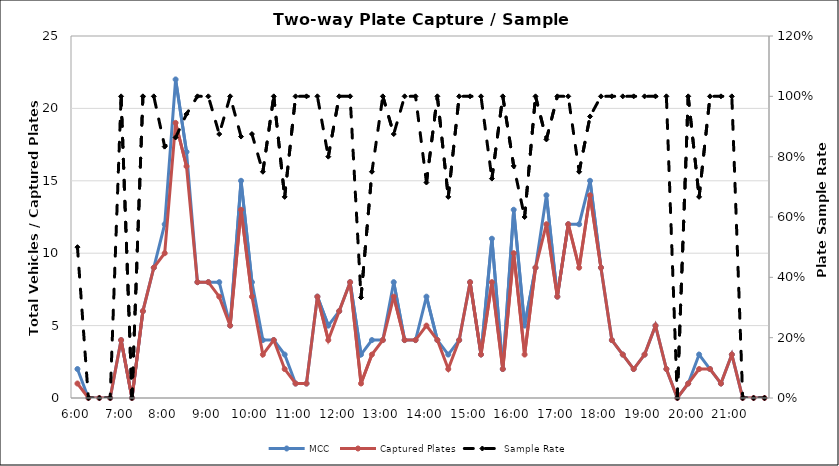
| Category | MCC | Captured Plates |
|---|---|---|
| 0.25 | 2 | 1 |
| 0.260416666666667 | 0 | 0 |
| 0.270833333333333 | 0 | 0 |
| 0.28125 | 0 | 0 |
| 0.291666666666667 | 4 | 4 |
| 0.302083333333333 | 0 | 0 |
| 0.3125 | 6 | 6 |
| 0.322916666666667 | 9 | 9 |
| 0.333333333333333 | 12 | 10 |
| 0.34375 | 22 | 19 |
| 0.354166666666667 | 17 | 16 |
| 0.364583333333333 | 8 | 8 |
| 0.375 | 8 | 8 |
| 0.385416666666667 | 8 | 7 |
| 0.395833333333333 | 5 | 5 |
| 0.40625 | 15 | 13 |
| 0.416666666666667 | 8 | 7 |
| 0.427083333333333 | 4 | 3 |
| 0.4375 | 4 | 4 |
| 0.447916666666667 | 3 | 2 |
| 0.458333333333333 | 1 | 1 |
| 0.46875 | 1 | 1 |
| 0.479166666666667 | 7 | 7 |
| 0.489583333333333 | 5 | 4 |
| 0.5 | 6 | 6 |
| 0.510416666666667 | 8 | 8 |
| 0.520833333333333 | 3 | 1 |
| 0.53125 | 4 | 3 |
| 0.541666666666667 | 4 | 4 |
| 0.552083333333333 | 8 | 7 |
| 0.5625 | 4 | 4 |
| 0.572916666666667 | 4 | 4 |
| 0.583333333333333 | 7 | 5 |
| 0.59375 | 4 | 4 |
| 0.604166666666667 | 3 | 2 |
| 0.614583333333333 | 4 | 4 |
| 0.625 | 8 | 8 |
| 0.635416666666667 | 3 | 3 |
| 0.645833333333333 | 11 | 8 |
| 0.65625 | 2 | 2 |
| 0.666666666666667 | 13 | 10 |
| 0.677083333333333 | 5 | 3 |
| 0.6875 | 9 | 9 |
| 0.697916666666667 | 14 | 12 |
| 0.708333333333333 | 7 | 7 |
| 0.71875 | 12 | 12 |
| 0.729166666666667 | 12 | 9 |
| 0.739583333333333 | 15 | 14 |
| 0.75 | 9 | 9 |
| 0.760416666666667 | 4 | 4 |
| 0.770833333333333 | 3 | 3 |
| 0.78125 | 2 | 2 |
| 0.791666666666667 | 3 | 3 |
| 0.802083333333333 | 5 | 5 |
| 0.8125 | 2 | 2 |
| 0.822916666666667 | 0 | 0 |
| 0.833333333333333 | 1 | 1 |
| 0.84375 | 3 | 2 |
| 0.854166666666667 | 2 | 2 |
| 0.864583333333333 | 1 | 1 |
| 0.875 | 3 | 3 |
| 0.885416666666667 | 0 | 0 |
| 0.895833333333333 | 0 | 0 |
| 0.90625 | 0 | 0 |